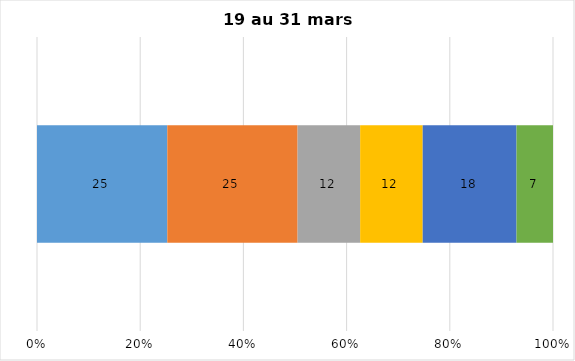
| Category | Plusieurs fois par jour | Une fois par jour | Quelques fois par semaine   | Une fois par semaine ou moins   |  Jamais   |  Je n’utilise pas les médias sociaux |
|---|---|---|---|---|---|---|
| 0 | 25 | 25 | 12 | 12 | 18 | 7 |